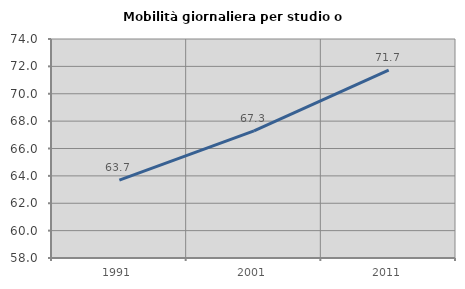
| Category | Mobilità giornaliera per studio o lavoro |
|---|---|
| 1991.0 | 63.69 |
| 2001.0 | 67.283 |
| 2011.0 | 71.726 |